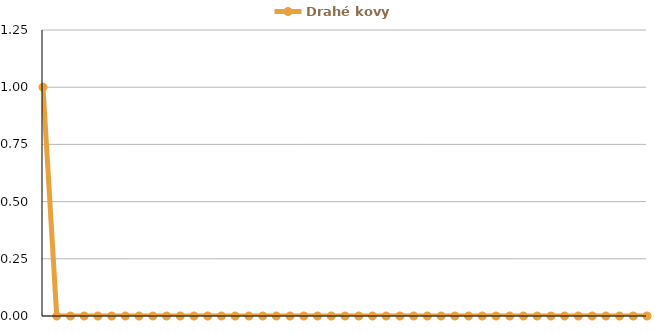
| Category | Drahé kovy |
|---|---|
| 0 | 1 |
| 1 | 0 |
| 2 | 0 |
| 3 | 0 |
| 4 | 0 |
| 5 | 0 |
| 6 | 0 |
| 7 | 0 |
| 8 | 0 |
| 9 | 0 |
| 10 | 0 |
| 11 | 0 |
| 12 | 0 |
| 13 | 0 |
| 14 | 0 |
| 15 | 0 |
| 16 | 0 |
| 17 | 0 |
| 18 | 0 |
| 19 | 0 |
| 20 | 0 |
| 21 | 0 |
| 22 | 0 |
| 23 | 0 |
| 24 | 0 |
| 25 | 0 |
| 26 | 0 |
| 27 | 0 |
| 28 | 0 |
| 29 | 0 |
| 30 | 0 |
| 31 | 0 |
| 32 | 0 |
| 33 | 0 |
| 34 | 0 |
| 35 | 0 |
| 36 | 0 |
| 37 | 0 |
| 38 | 0 |
| 39 | 0 |
| 40 | 0 |
| 41 | 0 |
| 42 | 0 |
| 43 | 0 |
| 44 | 0 |